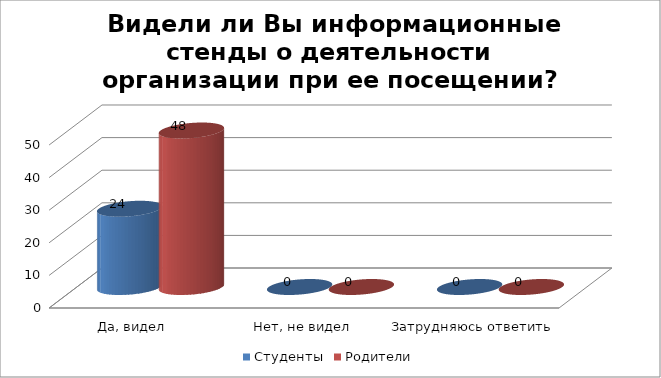
| Category | Студенты | Родители |
|---|---|---|
| Да, видел | 24 | 48 |
| Нет, не видел | 0 | 0 |
| Затрудняюсь ответить | 0 | 0 |